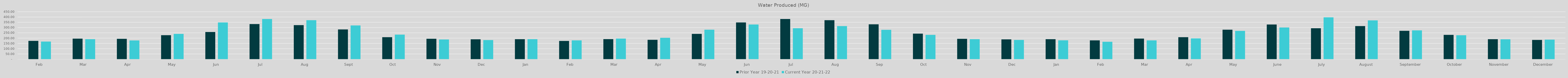
| Category | Prior Year 19-20-21 | Current Year 20-21-22 |
|---|---|---|
| Feb | 173.847 | 167.532 |
| Mar | 195.333 | 190.306 |
| Apr | 193.551 | 178.22 |
| May | 228.091 | 240.625 |
| Jun | 257.9 | 348.57 |
| Jul | 333.37 | 381.34 |
| Aug | 323.49 | 370.12 |
| Sep | 282.53 | 320.39 |
| Oct | 208.72 | 233.34 |
| Nov | 193.92 | 187.14 |
| Dec | 188.86 | 182.02 |
| Jan | 189.94 | 189.96 |
| Feb | 173.75 | 178.97 |
| Mar | 190.77 | 195.96 |
| Apr | 184.23 | 203.05 |
| May | 240.63 | 280.19 |
| Jun | 348.57 | 329.038 |
| Jul | 381.336 | 293.585 |
| Aug | 370.12 | 314.51 |
| Sep | 331.274 | 279.105 |
| Oct | 242.62 | 230.88 |
| Nov | 193.57 | 189.82 |
| Dec | 188.584 | 182.826 |
| Jan | 189.967 | 179.43 |
| Feb | 178.97 | 165.72 |
| Mar | 195.963 | 178.569 |
| Apr | 209.272 | 197.981 |
| May | 280.192 | 268.985 |
| June | 329.04 | 300.92 |
| July | 293.59 | 397.41 |
| August | 314.51 | 368.297 |
| September | 269.467 | 273.496 |
| October | 230.879 | 227.64 |
| November | 189.816 | 189.097 |
| December | 182.826 | 185.819 |